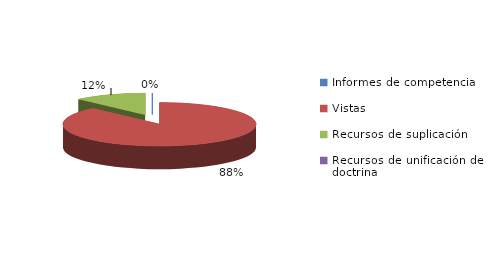
| Category | Series 0 |
|---|---|
| Informes de competencia | 0 |
| Vistas | 268 |
| Recursos de suplicación | 37 |
| Recursos de unificación de doctrina | 0 |